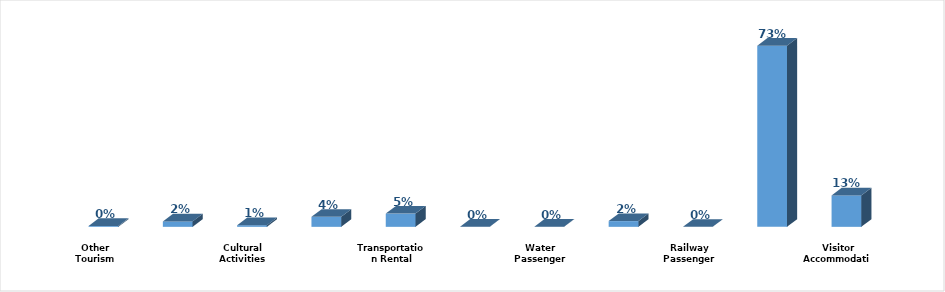
| Category | Series 0 |
|---|---|
| Visitor Accommodation | 0.126 |
| Food and Beverage | 0.725 |
| Railway Passenger Transport | 0 |
| Land Passenger Transport | 0.023 |
| Water Passenger Transport | 0.001 |
| Air Passenger Transport | 0 |
| Transportation Rental | 0.053 |
| Travel Agencies and Reservation Services  | 0.04 |
| Cultural Activities | 0.007 |
| Sports and Recreational Activities | 0.022 |
| Other Tourism Characteristic Services | 0.003 |